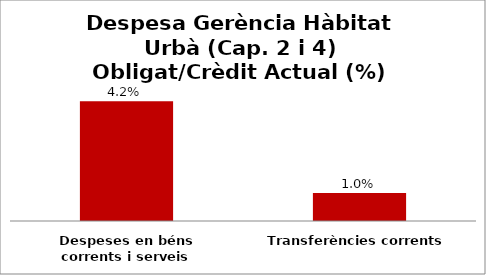
| Category | Series 0 |
|---|---|
| Despeses en béns corrents i serveis | 0.042 |
| Transferències corrents | 0.01 |